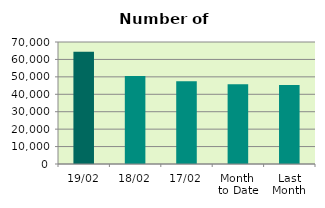
| Category | Series 0 |
|---|---|
| 19/02 | 64380 |
| 18/02 | 50496 |
| 17/02 | 47470 |
| Month 
to Date | 45725.333 |
| Last
Month | 45378.8 |